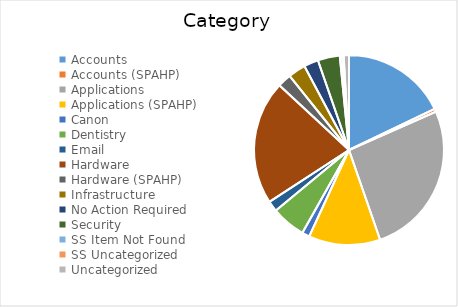
| Category | Series 0 |
|---|---|
| Accounts | 138 |
| Accounts (SPAHP) | 4 |
| Applications | 203 |
| Applications (SPAHP) | 94 |
| Canon | 10 |
| Dentistry | 45 |
| Email | 14 |
| Hardware | 163 |
| Hardware (SPAHP) | 18 |
| Infrastructure | 23 |
| No Action Required | 19 |
| Security | 29 |
| SS Item Not Found | 3 |
| SS Uncategorized | 2 |
| Uncategorized | 7 |